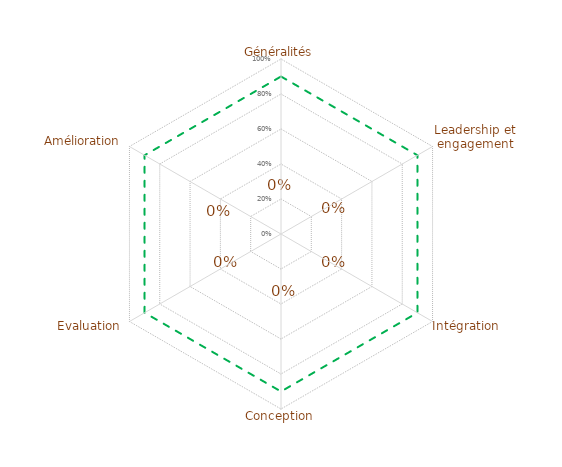
| Category | article 4 | Seuil limite |
|---|---|---|
| 0 | 0 | 0.9 |
| 1 | 0 | 0.9 |
| 2 | 0 | 0.9 |
| 3 | 0 | 0.9 |
| 4 | 0 | 0.9 |
| 5 | 0 | 0.9 |